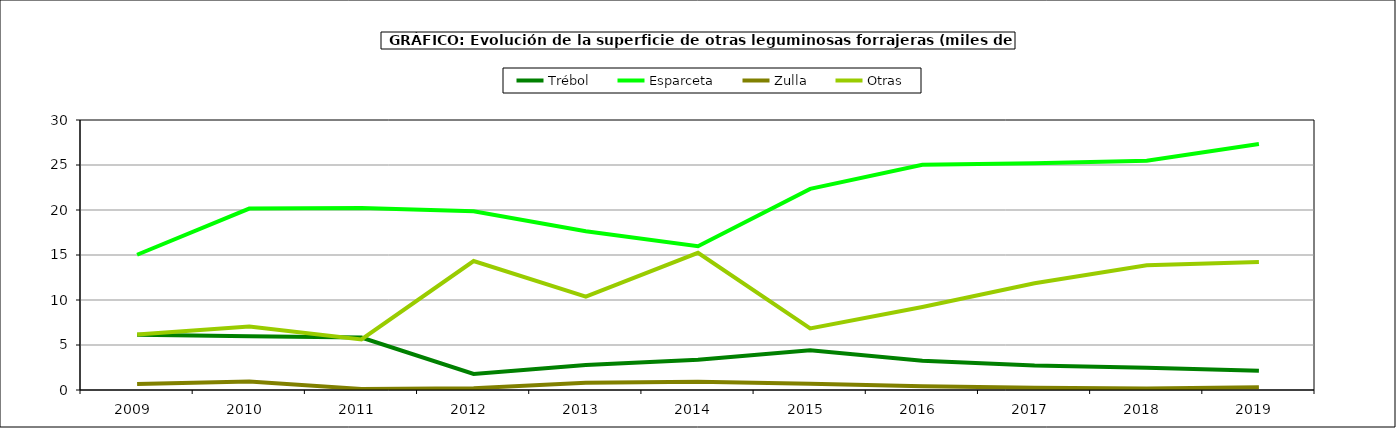
| Category | Trébol | Esparceta | Zulla | Otras |
|---|---|---|---|---|
| 2009.0 | 6.149 | 15.028 | 0.667 | 6.159 |
| 2010.0 | 5.977 | 20.154 | 0.957 | 7.056 |
| 2011.0 | 5.836 | 20.216 | 0.117 | 5.61 |
| 2012.0 | 1.782 | 19.86 | 0.202 | 14.331 |
| 2013.0 | 2.77 | 17.645 | 0.8 | 10.366 |
| 2014.0 | 3.361 | 15.981 | 0.92 | 15.244 |
| 2015.0 | 4.404 | 22.35 | 0.693 | 6.846 |
| 2016.0 | 3.241 | 25.025 | 0.423 | 9.224 |
| 2017.0 | 2.711 | 25.183 | 0.247 | 11.87 |
| 2018.0 | 2.475 | 25.483 | 0.159 | 13.872 |
| 2019.0 | 2.143 | 27.326 | 0.31 | 14.21 |